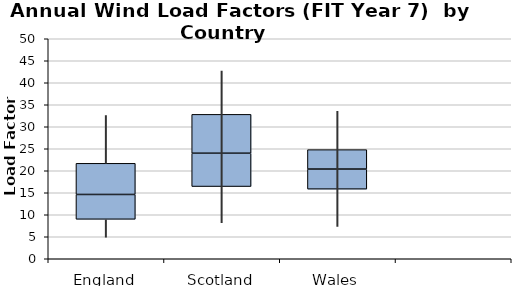
| Category | Series 0 | Series 1 | Series 2 |
|---|---|---|---|
| 0 | 8.967 | 5.644 | 7.079 |
| 1 | 16.413 | 7.574 | 8.832 |
| 2 | 15.822 | 4.562 | 4.415 |